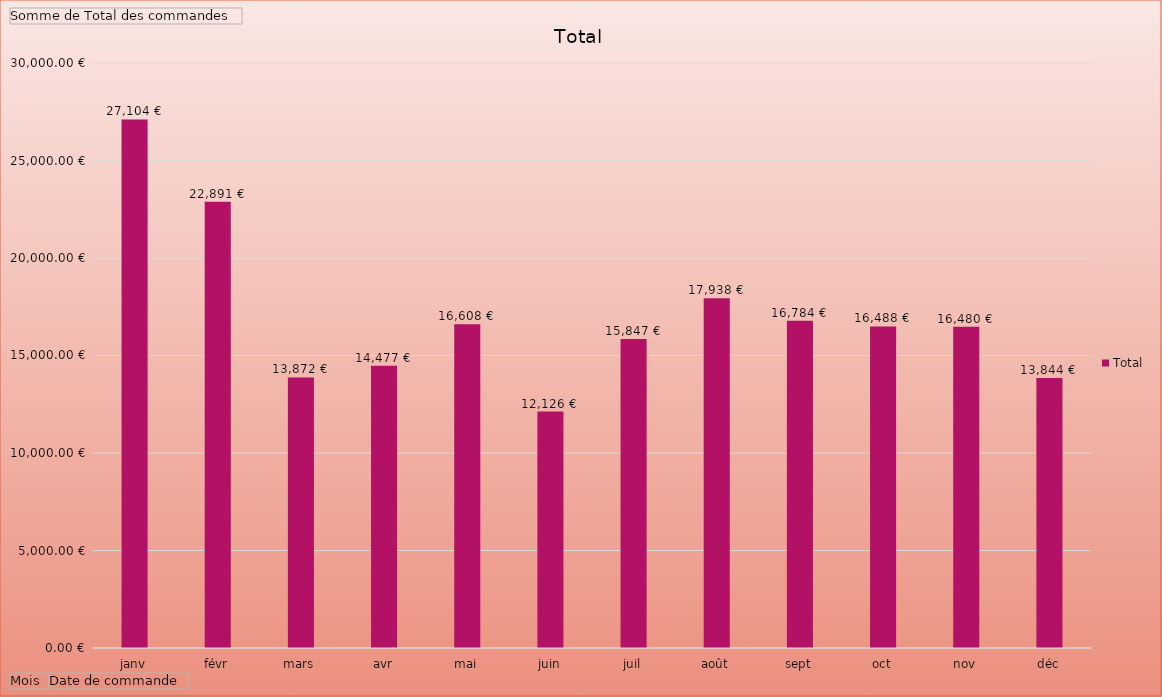
| Category | Total |
|---|---|
| janv | 27104.2 |
| févr | 22890.7 |
| mars | 13872.01 |
| avr | 14477.07 |
| mai | 16607.99 |
| juin | 12126.26 |
| juil | 15847.11 |
| août | 17937.6 |
| sept | 16784 |
| oct | 16487.76 |
| nov | 16480.27 |
| déc | 13843.98 |